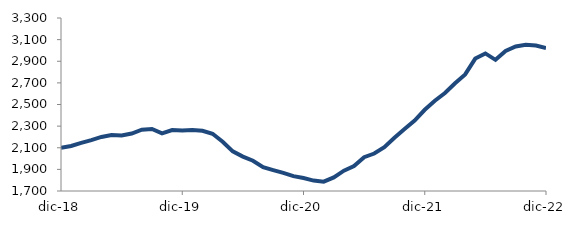
| Category | Series 0 |
|---|---|
| 2018-12-01 | 2098.706 |
| 2019-01-01 | 2116.727 |
| 2019-02-01 | 2144.876 |
| 2019-03-01 | 2171.077 |
| 2019-04-01 | 2199.941 |
| 2019-05-01 | 2218.125 |
| 2019-06-01 | 2213.708 |
| 2019-07-01 | 2231.834 |
| 2019-08-01 | 2267.321 |
| 2019-09-01 | 2273.768 |
| 2019-10-01 | 2233.304 |
| 2019-11-01 | 2263.898 |
| 2019-12-01 | 2259.926 |
| 2020-01-01 | 2265.053 |
| 2020-02-01 | 2256.766 |
| 2020-03-01 | 2229.161 |
| 2020-04-01 | 2155.791 |
| 2020-05-01 | 2066.843 |
| 2020-06-01 | 2018.026 |
| 2020-07-01 | 1979.558 |
| 2020-08-01 | 1920.368 |
| 2020-09-01 | 1893.237 |
| 2020-10-01 | 1867.4 |
| 2020-11-01 | 1837.195 |
| 2020-12-01 | 1819.546 |
| 2021-01-01 | 1796.45 |
| 2021-02-01 | 1786.603 |
| 2021-03-01 | 1826.072 |
| 2021-04-01 | 1887.798 |
| 2021-05-01 | 1930.372 |
| 2021-06-01 | 2012.926 |
| 2021-07-01 | 2046.434 |
| 2021-08-01 | 2105.806 |
| 2021-09-01 | 2192.514 |
| 2021-10-01 | 2272.972 |
| 2021-11-01 | 2351.334 |
| 2021-12-01 | 2451.171 |
| 2022-01-01 | 2534.613 |
| 2022-02-01 | 2606.357 |
| 2022-03-01 | 2696.948 |
| 2022-04-01 | 2778.264 |
| 2022-05-01 | 2924.682 |
| 2022-06-01 | 2972.281 |
| 2022-07-01 | 2912.933 |
| 2022-08-01 | 2994.913 |
| 2022-09-01 | 3036.467 |
| 2022-10-01 | 3052.236 |
| 2022-11-01 | 3044.767 |
| 2022-12-01 | 3023.141 |